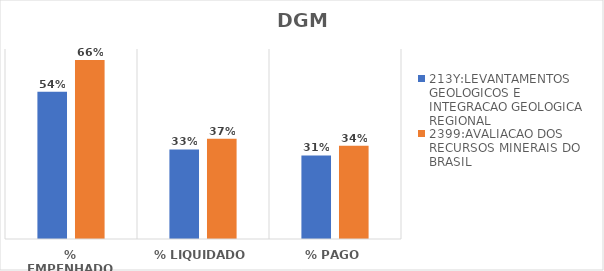
| Category | 213Y:LEVANTAMENTOS GEOLOGICOS E INTEGRACAO GEOLOGICA REGIONAL | 2399:AVALIACAO DOS RECURSOS MINERAIS DO BRASIL |
|---|---|---|
| % EMPENHADO | 0.542 | 0.66 |
| % LIQUIDADO | 0.33 | 0.369 |
| % PAGO | 0.308 | 0.344 |